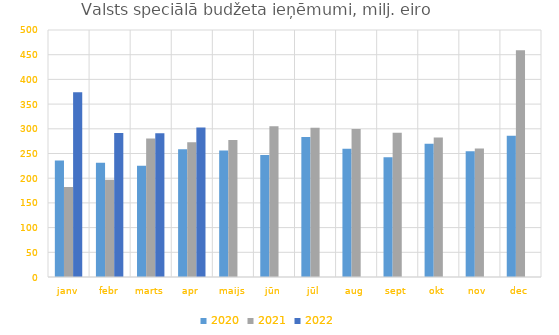
| Category | 2020 | 2021 | 2022 |
|---|---|---|---|
| janv | 235581.606 | 182213.528 | 373920.799 |
| febr | 231251.664 | 196739.364 | 291303.596 |
| marts | 225206.856 | 280261.929 | 290859.027 |
| apr | 258832.404 | 272916.721 | 302459.796 |
| maijs | 256203.758 | 277554.305 | 0 |
| jūn | 247189.712 | 304993.499 | 0 |
| jūl | 283516.218 | 302140.072 | 0 |
| aug | 259698.416 | 299731.991 | 0 |
| sept | 242624.019 | 292093.132 | 0 |
| okt | 269550.251 | 282344.858 | 0 |
| nov | 254562.176 | 260178.761 | 0 |
| dec | 286098.933 | 458943.507 | 0 |